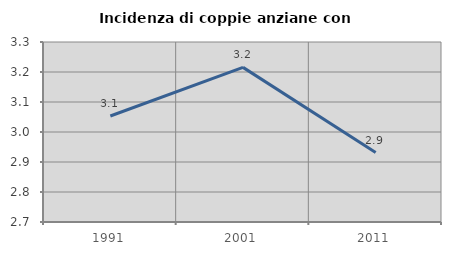
| Category | Incidenza di coppie anziane con figli |
|---|---|
| 1991.0 | 3.053 |
| 2001.0 | 3.215 |
| 2011.0 | 2.932 |